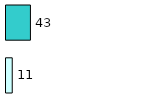
| Category | Series 0 | Series 1 |
|---|---|---|
| 0 | 11 | 43 |